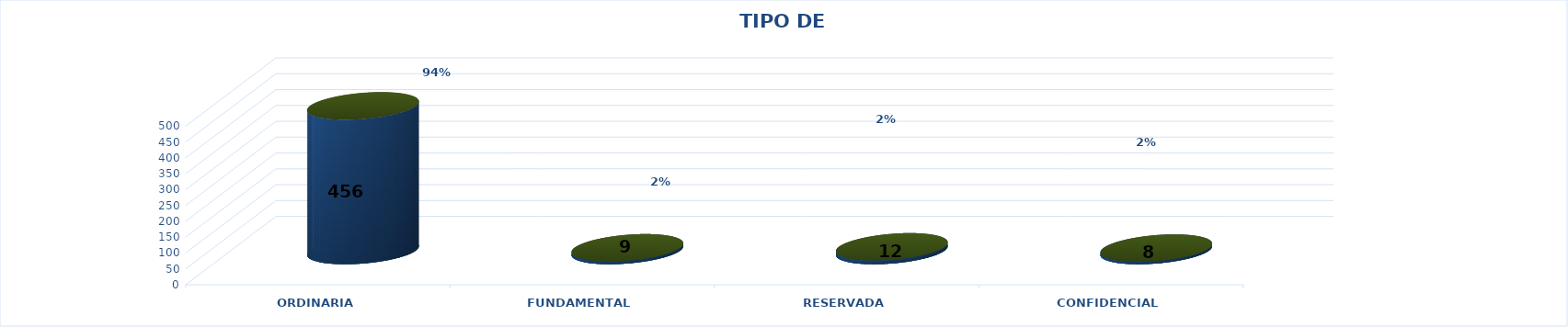
| Category | Series 0 | Series 2 | Series 1 | Series 3 | Series 4 |
|---|---|---|---|---|---|
| ORDINARIA |  |  |  | 456 | 0.94 |
| FUNDAMENTAL |  |  |  | 9 | 0.019 |
| RESERVADA |  |  |  | 12 | 0.025 |
| CONFIDENCIAL |  |  |  | 8 | 0.016 |